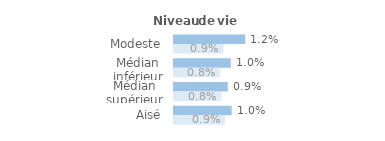
| Category | Series 1 | Series 0 |
|---|---|---|
| Modeste | 0.012 | 0.009 |
| Médian inférieur | 0.01 | 0.008 |
| Médian supérieur | 0.009 | 0.008 |
| Aisé | 0.01 | 0.009 |